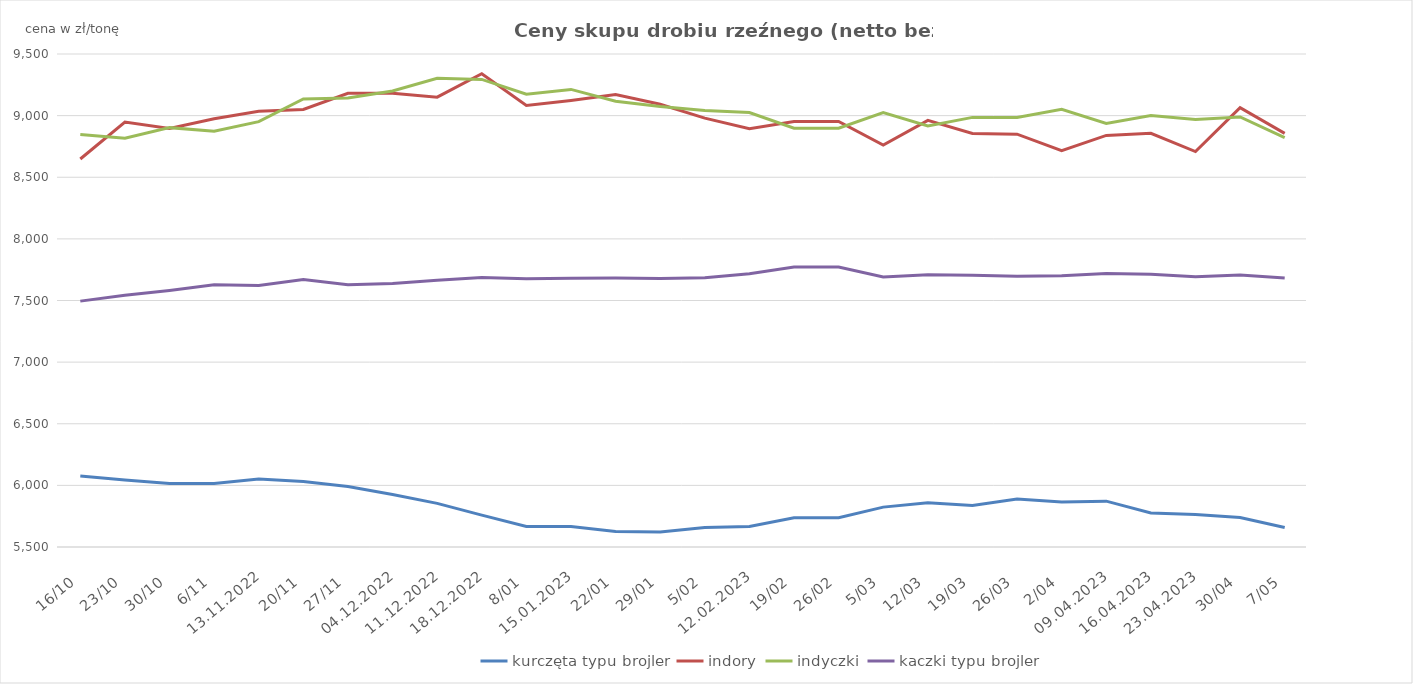
| Category | kurczęta typu brojler | indory | indyczki | kaczki typu brojler |
|---|---|---|---|---|
| 44850 | 6076.369 | 8647.99 | 8847.373 | 7494.919 |
| 44857 | 6043.437 | 8947.692 | 8815.921 | 7541.817 |
| 44864 | 6016.094 | 8895.005 | 8902.567 | 7581.999 |
| 44871 | 6014.466 | 8974.031 | 8873.022 | 7628.512 |
| 13.11.2022 | 6051.683 | 9036.064 | 8950.759 | 7622.435 |
| 45250 | 6032.111 | 9050.582 | 9135.498 | 7670.17 |
| 44892 | 5990.118 | 9181.51 | 9143.245 | 7626.923 |
| 04.12.2022 | 5925.57 | 9181.17 | 9199.58 | 7638.306 |
| 11.12.2022 | 5854.126 | 9149.81 | 9302.231 | 7663.356 |
| 18.12.2022 | 5758.933 | 9339.515 | 9293.576 | 7686.203 |
| 44934 | 5666.351 | 9082.169 | 9173.675 | 7675.966 |
| 15.01.2023 | 5665.742 | 9123.52 | 9212.707 | 7679.85 |
| 44948 | 5626.214 | 9170.448 | 9117.101 | 7681.895 |
| 44955 | 5622.652 | 9092.005 | 9073.148 | 7679.425 |
| 44962 | 5658.462 | 8980.022 | 9041.013 | 7684.515 |
| 12.02.2023 | 5666.524 | 8894.474 | 9025 | 7717.703 |
| 44976 | 5737.785 | 8952.583 | 8897.693 | 7771.669 |
| 44983 | 5737.785 | 8952.583 | 8897.693 | 7771.669 |
| 44990 | 5823.587 | 8761.637 | 9024.498 | 7691.518 |
| 44997 | 5859.541 | 8961.615 | 8916.365 | 7708.119 |
| 45004 | 5837.488 | 8854.601 | 8985.645 | 7704.388 |
| 45011 | 5889.062 | 8849.439 | 8985.253 | 7697.09 |
| 45018 | 5864.578 | 8716.341 | 9051.426 | 7700.589 |
| 09.04.2023 | 5872.148 | 8839.44 | 8937.007 | 7719.569 |
| 16.04.2023 | 5776.23 | 8857.093 | 9001.119 | 7713.26 |
| 23.04.2023 | 5763.263 | 8708.109 | 8969.078 | 7692.538 |
| 45046 | 5739.903 | 9065.145 | 8989.574 | 7707.094 |
| 45053 | 5658.773 | 8856.033 | 8821.647 | 7682.053 |